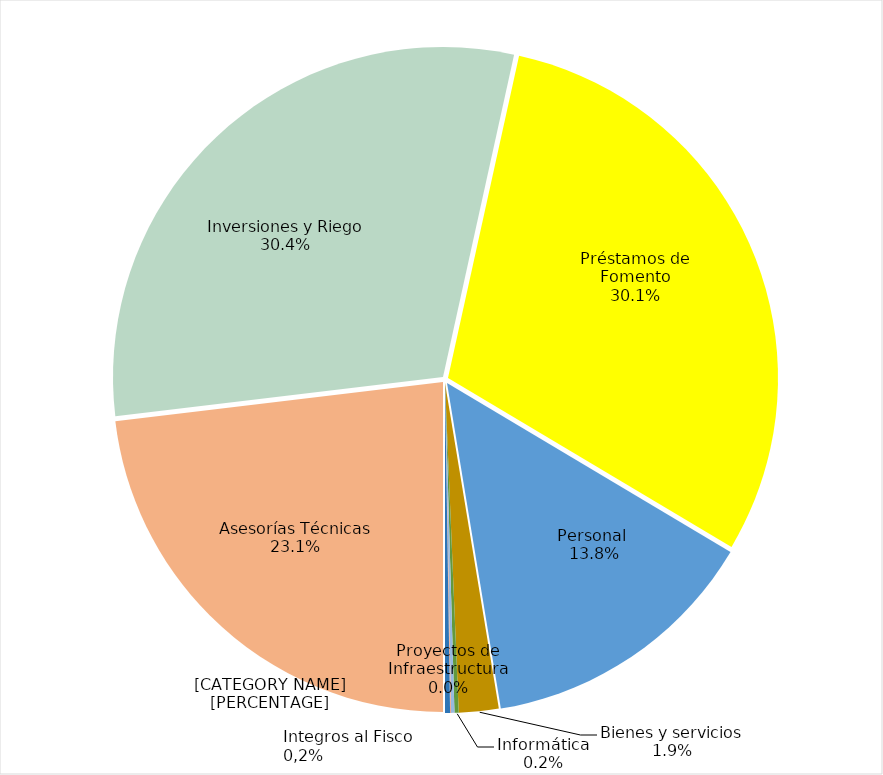
| Category | Series 0 |
|---|---|
| Asesorías Técnicas | 81048832 |
| Inversiones y Riego | 106509698 |
| Préstamos de Fomento | 105591887 |
| Personal  | 48564225 |
| Bienes y servicios | 6827889 |
| Informática | 720860 |
| Vehículos, Maquinas y Equipos | 579422 |
| Proyectos de Infraestructura | 163150 |
| Integros al Fisco y Otros | 861858 |